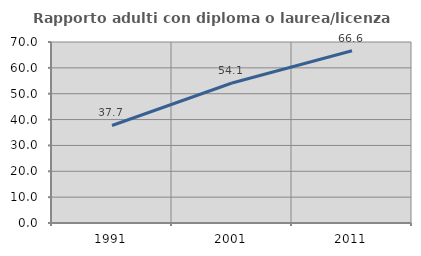
| Category | Rapporto adulti con diploma o laurea/licenza media  |
|---|---|
| 1991.0 | 37.714 |
| 2001.0 | 54.132 |
| 2011.0 | 66.602 |